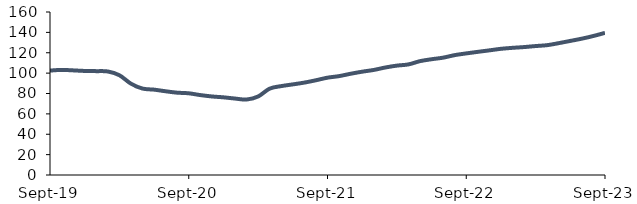
| Category | Series 0 |
|---|---|
| 2019-09-01 | 102.492 |
| 2019-10-01 | 103.172 |
| 2019-11-01 | 102.703 |
| 2019-12-01 | 102.142 |
| 2020-01-01 | 101.951 |
| 2020-02-01 | 101.62 |
| 2020-03-01 | 97.938 |
| 2020-04-01 | 89.65 |
| 2020-05-01 | 84.839 |
| 2020-06-01 | 83.781 |
| 2020-07-01 | 82.182 |
| 2020-08-01 | 80.808 |
| 2020-09-01 | 80.198 |
| 2020-10-01 | 78.439 |
| 2020-11-01 | 77.102 |
| 2020-12-01 | 76.237 |
| 2021-01-01 | 75.045 |
| 2021-02-01 | 74.096 |
| 2021-03-01 | 77.079 |
| 2021-04-01 | 84.788 |
| 2021-05-01 | 87.267 |
| 2021-06-01 | 88.947 |
| 2021-07-01 | 90.706 |
| 2021-08-01 | 93 |
| 2021-09-01 | 95.533 |
| 2021-10-01 | 97.064 |
| 2021-11-01 | 99.379 |
| 2021-12-01 | 101.416 |
| 2022-01-01 | 103.119 |
| 2022-02-01 | 105.529 |
| 2022-03-01 | 107.371 |
| 2022-04-01 | 108.553 |
| 2022-05-01 | 111.761 |
| 2022-06-01 | 113.626 |
| 2022-07-01 | 115.177 |
| 2022-08-01 | 117.668 |
| 2022-09-01 | 119.358 |
| 2022-10-01 | 120.89 |
| 2022-11-01 | 122.346 |
| 2022-12-01 | 123.861 |
| 2023-01-01 | 124.823 |
| 2023-02-01 | 125.58 |
| 2023-03-01 | 126.574 |
| 2023-04-01 | 127.453 |
| 2023-05-01 | 129.424 |
| 2023-06-01 | 131.612 |
| 2023-07-01 | 133.833 |
| 2023-08-01 | 136.462 |
| 2023-09-01 | 139.531 |